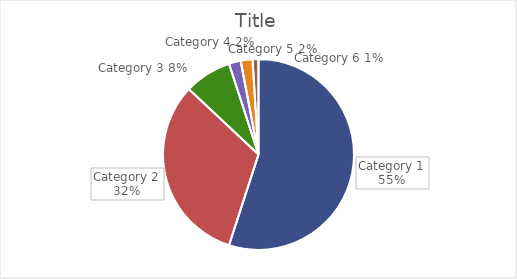
| Category | Votes |
|---|---|
| Category 1 | 0.55 |
| Category 2 | 0.32 |
| Category 3 | 0.08 |
| Category 4 | 0.02 |
| Category 5 | 0.02 |
| Category 6 | 0.01 |